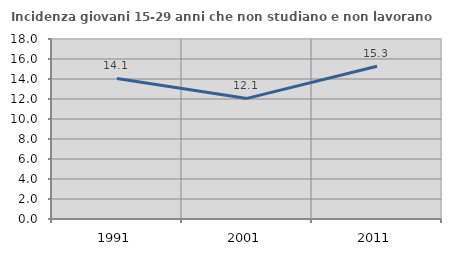
| Category | Incidenza giovani 15-29 anni che non studiano e non lavorano  |
|---|---|
| 1991.0 | 14.058 |
| 2001.0 | 12.06 |
| 2011.0 | 15.278 |